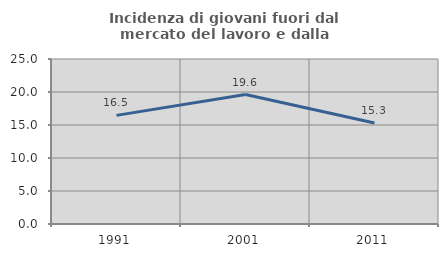
| Category | Incidenza di giovani fuori dal mercato del lavoro e dalla formazione  |
|---|---|
| 1991.0 | 16.458 |
| 2001.0 | 19.621 |
| 2011.0 | 15.314 |